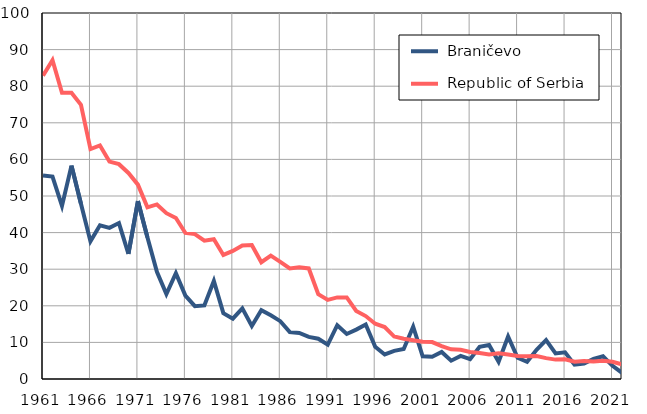
| Category |  Braničevo |  Republic of Serbia |
|---|---|---|
| 1961.0 | 55.6 | 82.9 |
| 1962.0 | 55.3 | 87.1 |
| 1963.0 | 47.3 | 78.2 |
| 1964.0 | 58.3 | 78.2 |
| 1965.0 | 47.9 | 74.9 |
| 1966.0 | 37.6 | 62.8 |
| 1967.0 | 42 | 63.8 |
| 1968.0 | 41.3 | 59.4 |
| 1969.0 | 42.6 | 58.7 |
| 1970.0 | 34.2 | 56.3 |
| 1971.0 | 48.6 | 53.1 |
| 1972.0 | 38.7 | 46.9 |
| 1973.0 | 29.3 | 47.7 |
| 1974.0 | 23.2 | 45.3 |
| 1975.0 | 28.9 | 44 |
| 1976.0 | 22.8 | 39.9 |
| 1977.0 | 19.9 | 39.6 |
| 1978.0 | 20.1 | 37.8 |
| 1979.0 | 26.8 | 38.2 |
| 1980.0 | 18 | 33.9 |
| 1981.0 | 16.5 | 35 |
| 1982.0 | 19.3 | 36.5 |
| 1983.0 | 14.5 | 36.6 |
| 1984.0 | 18.8 | 31.9 |
| 1985.0 | 17.4 | 33.7 |
| 1986.0 | 15.8 | 32 |
| 1987.0 | 12.8 | 30.2 |
| 1988.0 | 12.6 | 30.5 |
| 1989.0 | 11.5 | 30.2 |
| 1990.0 | 11 | 23.2 |
| 1991.0 | 9.4 | 21.6 |
| 1992.0 | 14.7 | 22.3 |
| 1993.0 | 12.3 | 22.3 |
| 1994.0 | 13.5 | 18.6 |
| 1995.0 | 14.9 | 17.2 |
| 1996.0 | 8.8 | 15.1 |
| 1997.0 | 6.7 | 14.2 |
| 1998.0 | 7.7 | 11.6 |
| 1999.0 | 8.2 | 11 |
| 2000.0 | 14.3 | 10.6 |
| 2001.0 | 6.2 | 10.2 |
| 2002.0 | 6.1 | 10.1 |
| 2003.0 | 7.4 | 9 |
| 2004.0 | 5 | 8.1 |
| 2005.0 | 6.3 | 8 |
| 2006.0 | 5.4 | 7.4 |
| 2007.0 | 8.8 | 7.1 |
| 2008.0 | 9.3 | 6.7 |
| 2009.0 | 4.7 | 7 |
| 2010.0 | 11.6 | 6.7 |
| 2011.0 | 5.8 | 6.3 |
| 2012.0 | 4.7 | 6.2 |
| 2013.0 | 8 | 6.3 |
| 2014.0 | 10.6 | 5.7 |
| 2015.0 | 7 | 5.3 |
| 2016.0 | 7.3 | 5.4 |
| 2017.0 | 3.9 | 4.7 |
| 2018.0 | 4.2 | 4.9 |
| 2019.0 | 5.5 | 4.8 |
| 2020.0 | 6.2 | 5 |
| 2021.0 | 3.6 | 4.7 |
| 2022.0 | 1.7 | 4 |